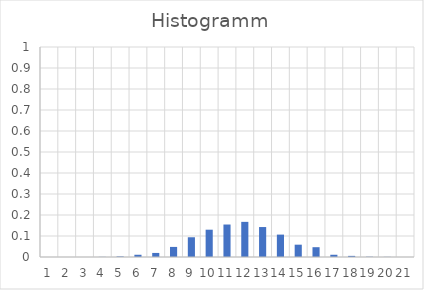
| Category | Series 0 |
|---|---|
| 0 | 0 |
| 1 | 0 |
| 2 | 0 |
| 3 | 0.001 |
| 4 | 0.003 |
| 5 | 0.011 |
| 6 | 0.019 |
| 7 | 0.048 |
| 8 | 0.094 |
| 9 | 0.13 |
| 10 | 0.155 |
| 11 | 0.167 |
| 12 | 0.143 |
| 13 | 0.107 |
| 14 | 0.059 |
| 15 | 0.047 |
| 16 | 0.011 |
| 17 | 0.005 |
| 18 | 0.001 |
| 19 | 0.001 |
| 20 | 0 |